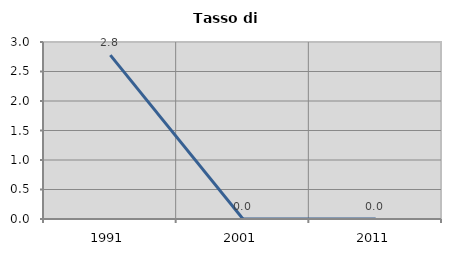
| Category | Tasso di disoccupazione   |
|---|---|
| 1991.0 | 2.778 |
| 2001.0 | 0 |
| 2011.0 | 0 |